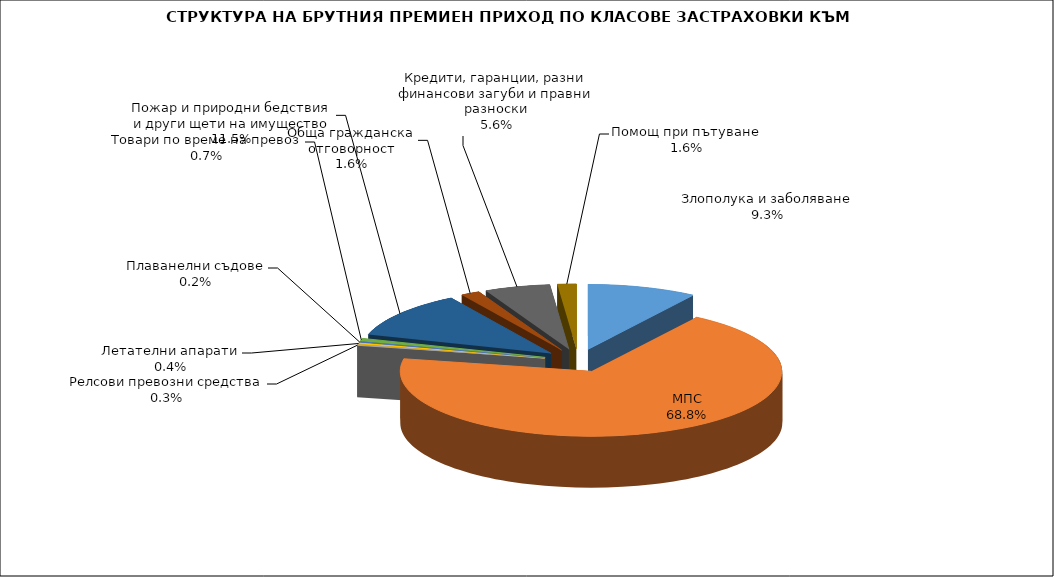
| Category | Злополука и заболяване |
|---|---|
| Злополука и заболяване | 0.093 |
| МПС | 0.688 |
| Релсови превозни средства | 0.003 |
| Летателни апарати | 0.004 |
| Плаванелни съдове | 0.002 |
| Товари по време на превоз | 0.007 |
| Пожар и природни бедствия и други щети на имущество | 0.115 |
| Обща гражданска отговорност | 0.016 |
| Кредити, гаранции, разни финансови загуби и правни разноски | 0.056 |
| Помощ при пътуване | 0.016 |